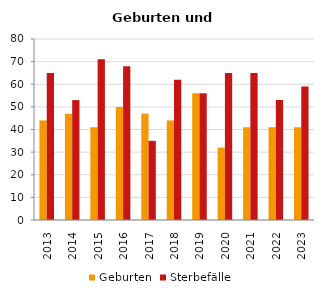
| Category | Geburten | Sterbefälle |
|---|---|---|
| 2013.0 | 44 | 65 |
| 2014.0 | 47 | 53 |
| 2015.0 | 41 | 71 |
| 2016.0 | 50 | 68 |
| 2017.0 | 47 | 35 |
| 2018.0 | 44 | 62 |
| 2019.0 | 56 | 56 |
| 2020.0 | 32 | 65 |
| 2021.0 | 41 | 65 |
| 2022.0 | 41 | 53 |
| 2023.0 | 41 | 59 |